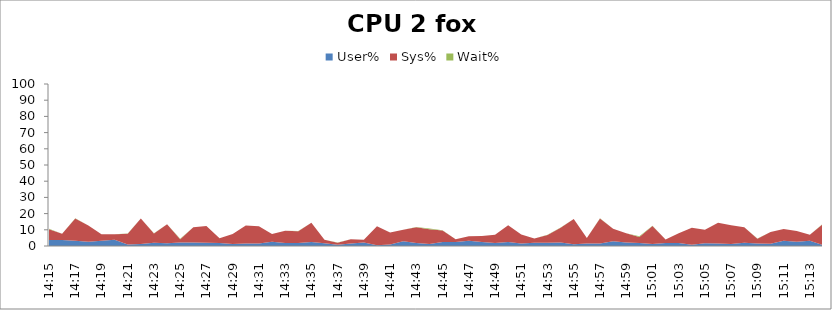
| Category | User% | Sys% | Wait% |
|---|---|---|---|
| 14:15 | 3.7 | 6.7 | 0.3 |
| 14:16 | 3.7 | 3.9 | 0 |
| 14:17 | 3.3 | 13.7 | 0.1 |
| 14:18 | 2.7 | 10 | 0 |
| 14:19 | 3.3 | 4 | 0 |
| 14:20 | 3.8 | 3.4 | 0 |
| 14:21 | 0.9 | 6.7 | 0.1 |
| 14:22 | 1.2 | 15.7 | 0 |
| 14:23 | 2 | 5.7 | 0.1 |
| 14:24 | 1.7 | 11.7 | 0.1 |
| 14:25 | 2.1 | 2.1 | 0.2 |
| 14:26 | 2.2 | 9.3 | 0 |
| 14:27 | 2 | 10.3 | 0.1 |
| 14:28 | 1.8 | 3 | 0 |
| 14:29 | 1.2 | 6.2 | 0 |
| 14:30 | 1.5 | 11.2 | 0 |
| 14:31 | 1.5 | 10.7 | 0 |
| 14:32 | 2.6 | 4.8 | 0 |
| 14:33 | 1.9 | 7.5 | 0 |
| 14:34 | 1.8 | 7.3 | 0.1 |
| 14:35 | 2.4 | 11.9 | 0 |
| 14:36 | 1.7 | 2.1 | 0.1 |
| 14:37 | 0.7 | 1.3 | 0.1 |
| 14:38 | 1.6 | 2.6 | 0 |
| 14:39 | 2.2 | 1.6 | 0.1 |
| 14:40 | 0.5 | 11.7 | 0 |
| 14:41 | 0.9 | 7.4 | 0.1 |
| 14:42 | 3 | 7 | 0 |
| 14:43 | 1.8 | 9.7 | 0.3 |
| 14:44 | 1.3 | 9.1 | 0.4 |
| 14:45 | 2.4 | 7.2 | 0.1 |
| 14:46 | 2.4 | 1.8 | 0 |
| 14:47 | 3.2 | 2.8 | 0 |
| 14:48 | 2.5 | 3.6 | 0 |
| 14:49 | 1.9 | 5.1 | 0 |
| 14:50 | 2.4 | 10.4 | 0 |
| 14:51 | 1.6 | 5.5 | 0 |
| 14:52 | 2 | 2.7 | 0 |
| 14:53 | 2 | 4.8 | 0.1 |
| 14:54 | 2.2 | 9.1 | 0.1 |
| 14:55 | 1.1 | 15.6 | 0 |
| 14:56 | 1.5 | 3.4 | 0 |
| 14:57 | 1.5 | 15.5 | 0.1 |
| 14:58 | 3 | 7.6 | 0.1 |
| 14:59 | 2.2 | 5.7 | 0 |
| 15:00 | 1.9 | 3.7 | 0.4 |
| 15:01 | 1.3 | 11.1 | 0.1 |
| 15:02 | 1.8 | 2.2 | 0 |
| 15:03 | 1.8 | 6.1 | 0 |
| 15:04 | 0.8 | 10.4 | 0 |
| 15:05 | 1.7 | 8.3 | 0.1 |
| 15:06 | 1.5 | 12.8 | 0 |
| 15:07 | 1.3 | 11.5 | 0 |
| 15:08 | 2 | 9.5 | 0 |
| 15:09 | 1.6 | 2.9 | 0.1 |
| 15:10 | 1.4 | 7.2 | 0.1 |
| 15:11 | 3.3 | 7.2 | 0 |
| 15:12 | 2.6 | 6.6 | 0 |
| 15:13 | 3.2 | 3.7 | 0 |
| 15:14 | 0.6 | 13.1 | 0.1 |